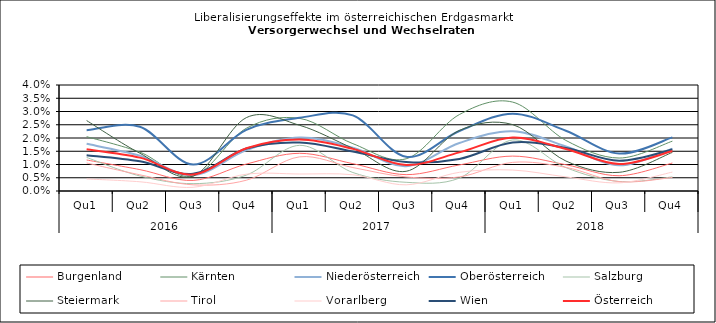
| Category | Burgenland | Kärnten | Niederösterreich | Oberösterreich | Salzburg | Steiermark | Tirol | Vorarlberg | Wien | Österreich |
|---|---|---|---|---|---|---|---|---|---|---|
| 0 | 0.012 | 0.021 | 0.018 | 0.023 | 0.013 | 0.027 | 0.011 | 0.005 | 0.014 | 0.016 |
| 1 | 0.008 | 0.015 | 0.013 | 0.024 | 0.006 | 0.014 | 0.006 | 0.003 | 0.011 | 0.013 |
| 2 | 0.004 | 0.006 | 0.006 | 0.01 | 0.003 | 0.006 | 0.002 | 0.001 | 0.006 | 0.006 |
| 3 | 0.01 | 0.024 | 0.015 | 0.023 | 0.006 | 0.028 | 0.004 | 0.006 | 0.016 | 0.016 |
| 4 | 0.014 | 0.027 | 0.02 | 0.028 | 0.017 | 0.025 | 0.013 | 0.006 | 0.018 | 0.019 |
| 5 | 0.01 | 0.018 | 0.016 | 0.029 | 0.007 | 0.016 | 0.009 | 0.006 | 0.015 | 0.016 |
| 6 | 0.006 | 0.012 | 0.009 | 0.013 | 0.003 | 0.007 | 0.005 | 0.002 | 0.011 | 0.01 |
| 7 | 0.01 | 0.029 | 0.018 | 0.023 | 0.005 | 0.023 | 0.005 | 0.007 | 0.012 | 0.015 |
| 8 | 0.013 | 0.034 | 0.023 | 0.029 | 0.019 | 0.025 | 0.011 | 0.008 | 0.018 | 0.02 |
| 9 | 0.01 | 0.019 | 0.017 | 0.023 | 0.009 | 0.011 | 0.009 | 0.005 | 0.016 | 0.016 |
| 10 | 0.006 | 0.012 | 0.01 | 0.014 | 0.004 | 0.007 | 0.004 | 0.003 | 0.011 | 0.01 |
| 11 | 0.011 | 0.019 | 0.016 | 0.02 | 0.005 | 0.015 | 0.005 | 0.007 | 0.016 | 0.015 |